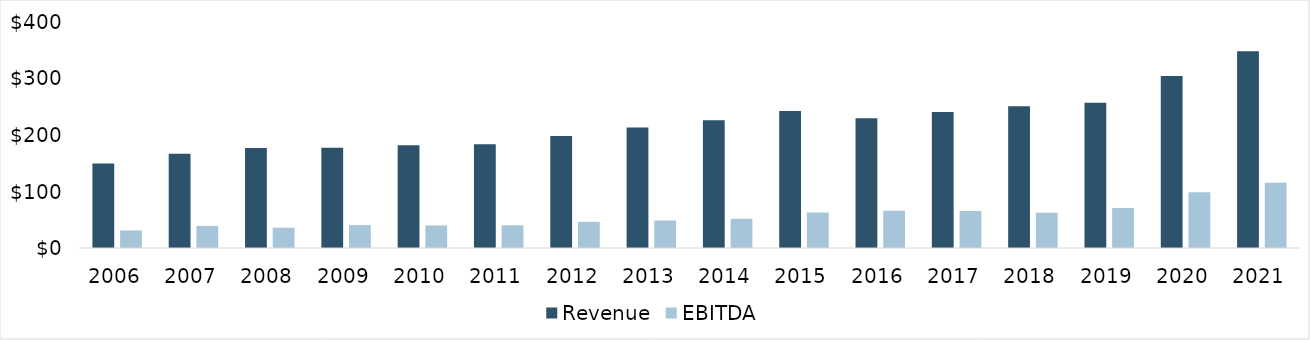
| Category | Revenue | EBITDA |
|---|---|---|
| 2006.0 | 149.4 | 31.1 |
| 2007.0 | 166.856 | 39.061 |
| 2008.0 | 176.928 | 35.867 |
| 2009.0 | 177.627 | 40.454 |
| 2010.0 | 181.801 | 39.898 |
| 2011.0 | 183.514 | 40.205 |
| 2012.0 | 198.191 | 46.343 |
| 2013.0 | 213.074 | 48.654 |
| 2014.0 | 226.124 | 51.66 |
| 2015.0 | 242.502 | 62.728 |
| 2016.0 | 229.571 | 66.025 |
| 2017.0 | 240.638 | 65.52 |
| 2018.0 | 250.857 | 62.471 |
| 2019.0 | 257.068 | 70.733 |
| 2020.0 | 304.614 | 98.777 |
| 2021.0 | 348.293 | 115.491 |